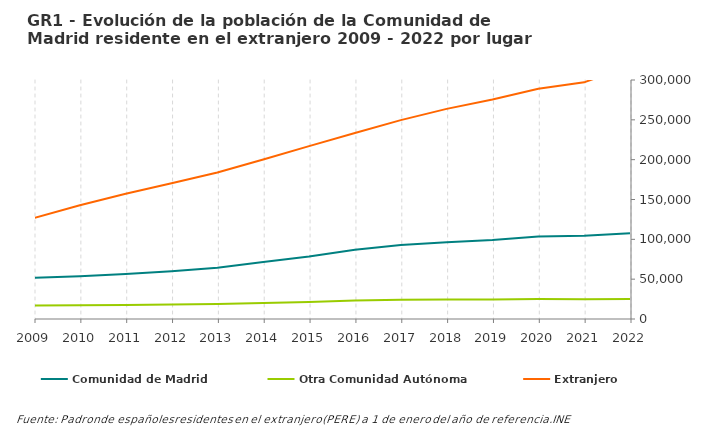
| Category | Comunidad de Madrid | Otra Comunidad Autónoma | Extranjero |
|---|---|---|---|
| 2022.0 | 107664 | 24962 | 317795 |
| 2021.0 | 104479 | 24896 | 297090 |
| 2020.0 | 103550 | 25234 | 289140 |
| 2019.0 | 99165 | 24564 | 275595 |
| 2018.0 | 96437 | 24443 | 263753 |
| 2017.0 | 92814 | 24119 | 249644 |
| 2016.0 | 87017 | 23122 | 233520 |
| 2015.0 | 78433 | 21470 | 216962 |
| 2014.0 | 71457 | 20114 | 200264 |
| 2013.0 | 64330 | 18826 | 183827 |
| 2012.0 | 59882 | 18178 | 170457 |
| 2011.0 | 56563 | 17483 | 157266 |
| 2010.0 | 53778 | 17112 | 142740 |
| 2009.0 | 51620 | 16891 | 126792 |